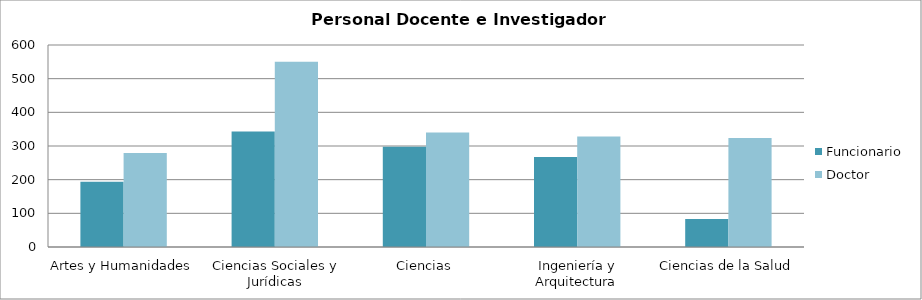
| Category | Funcionario | Doctor |
|---|---|---|
| Artes y Humanidades | 194 | 279 |
| Ciencias Sociales y Jurídicas | 343 | 550 |
| Ciencias | 298 | 340 |
| Ingeniería y Arquitectura | 267 | 328 |
| Ciencias de la Salud | 83 | 324 |